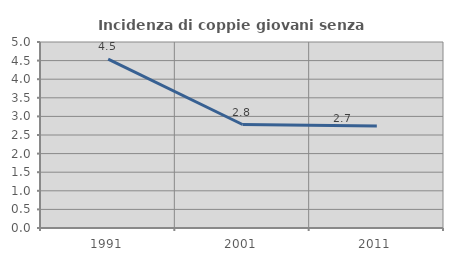
| Category | Incidenza di coppie giovani senza figli |
|---|---|
| 1991.0 | 4.538 |
| 2001.0 | 2.782 |
| 2011.0 | 2.744 |